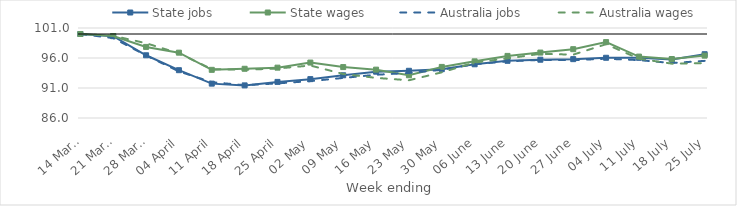
| Category | State jobs | State wages | Australia jobs | Australia wages |
|---|---|---|---|---|
| 2020-03-14 | 100 | 100 | 100 | 100 |
| 2020-03-21 | 99.642 | 99.658 | 99.322 | 99.708 |
| 2020-03-28 | 96.454 | 97.847 | 96.426 | 98.464 |
| 2020-04-04 | 93.968 | 96.89 | 93.761 | 96.774 |
| 2020-04-11 | 91.728 | 94.028 | 91.978 | 94.155 |
| 2020-04-18 | 91.435 | 94.204 | 91.464 | 94.034 |
| 2020-04-25 | 92.016 | 94.391 | 91.766 | 94.248 |
| 2020-05-02 | 92.477 | 95.238 | 92.148 | 94.747 |
| 2020-05-09 | 93.122 | 94.485 | 92.676 | 93.34 |
| 2020-05-16 | 93.72 | 94.059 | 93.207 | 92.686 |
| 2020-05-23 | 93.868 | 93.123 | 93.505 | 92.29 |
| 2020-05-30 | 94.133 | 94.513 | 94.037 | 93.611 |
| 2020-06-06 | 94.953 | 95.44 | 94.972 | 95.238 |
| 2020-06-13 | 95.532 | 96.349 | 95.44 | 95.935 |
| 2020-06-20 | 95.715 | 96.904 | 95.683 | 96.696 |
| 2020-06-27 | 95.809 | 97.469 | 95.641 | 96.56 |
| 2020-07-04 | 96.037 | 98.649 | 95.882 | 98.301 |
| 2020-07-11 | 96.03 | 96.237 | 95.648 | 95.883 |
| 2020-07-18 | 95.752 | 95.829 | 95.158 | 95.058 |
| 2020-07-25 | 96.628 | 96.398 | 95.522 | 95.15 |